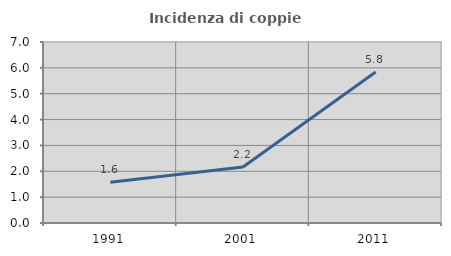
| Category | Incidenza di coppie miste |
|---|---|
| 1991.0 | 1.577 |
| 2001.0 | 2.165 |
| 2011.0 | 5.838 |